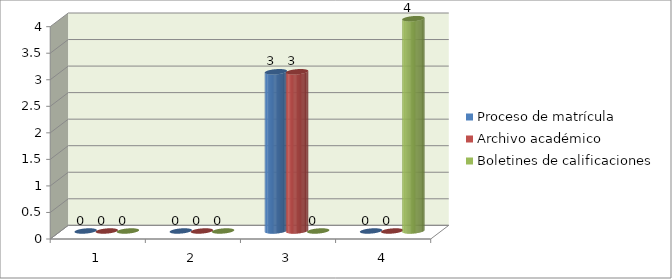
| Category | Proceso de matrícula | Archivo académico | Boletines de calificaciones |
|---|---|---|---|
| 0 | 0 | 0 | 0 |
| 1 | 0 | 0 | 0 |
| 2 | 3 | 3 | 0 |
| 3 | 0 | 0 | 4 |